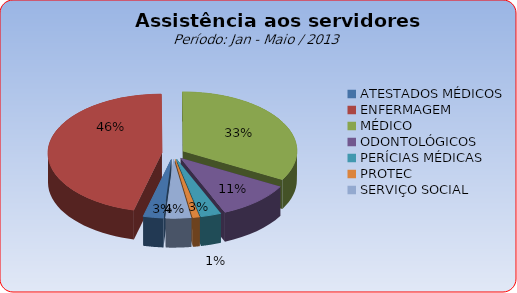
| Category | Series 0 |
|---|---|
| ATESTADOS MÉDICOS | 2.847 |
| ENFERMAGEM | 45.937 |
| MÉDICO | 33.205 |
| ODONTOLÓGICOS | 10.557 |
| PERÍCIAS MÉDICAS | 2.911 |
| PROTEC | 0.96 |
| SERVIÇO SOCIAL | 3.583 |